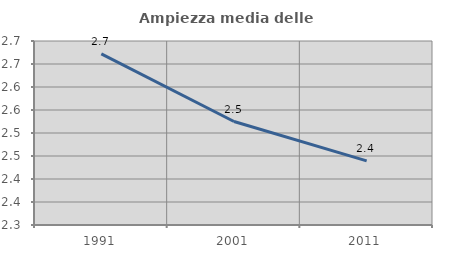
| Category | Ampiezza media delle famiglie |
|---|---|
| 1991.0 | 2.672 |
| 2001.0 | 2.525 |
| 2011.0 | 2.44 |